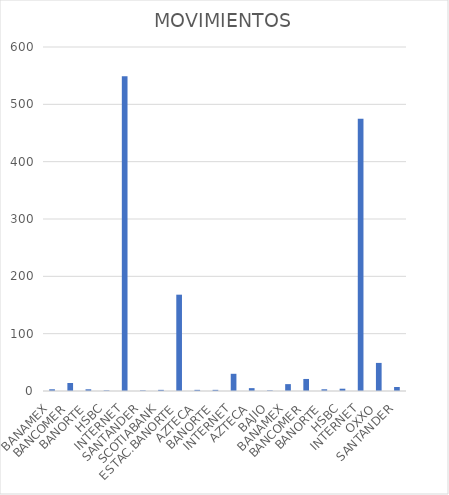
| Category | MOVIMIENTOS |
|---|---|
| BANAMEX | 3 |
| BANCOMER | 14 |
| BANORTE | 3 |
| HSBC | 1 |
| INTERNET | 549 |
| SANTANDER | 1 |
| SCOTIABANK | 2 |
| ESTAC.BANORTE | 168 |
| AZTECA | 2 |
| BANORTE | 2 |
| INTERNET | 30 |
| AZTECA | 5 |
| BAJIO | 1 |
| BANAMEX | 12 |
| BANCOMER | 21 |
| BANORTE | 3 |
| HSBC | 4 |
| INTERNET | 475 |
| OXXO | 49 |
| SANTANDER | 7 |